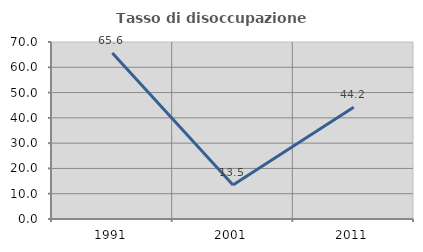
| Category | Tasso di disoccupazione giovanile  |
|---|---|
| 1991.0 | 65.625 |
| 2001.0 | 13.462 |
| 2011.0 | 44.186 |